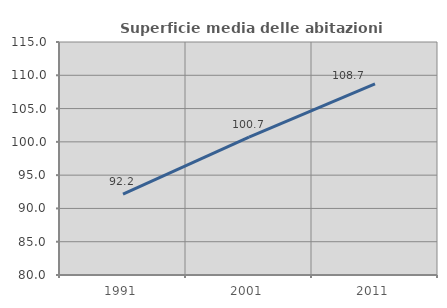
| Category | Superficie media delle abitazioni occupate |
|---|---|
| 1991.0 | 92.152 |
| 2001.0 | 100.715 |
| 2011.0 | 108.712 |